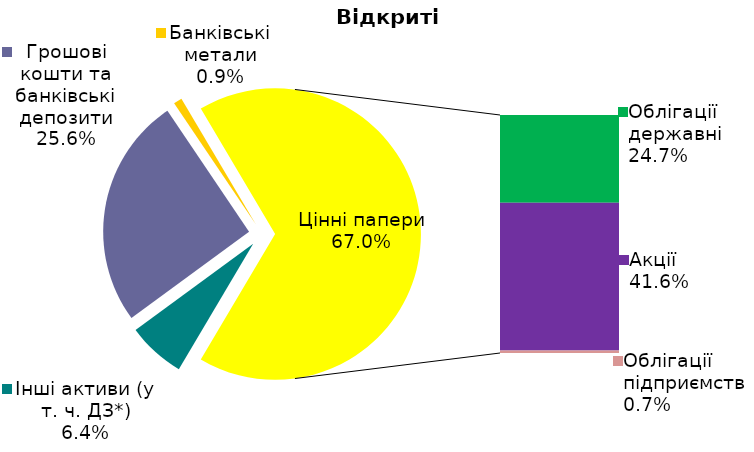
| Category | Series 0 |
|---|---|
| Інші активи (у т. ч. ДЗ*) | 0.064 |
| Грошові кошти та банківські депозити | 0.256 |
| Банківські метали | 0.009 |
| Облігації державні  | 0.247 |
| Акції | 0.416 |
| Облігації підприємств | 0.007 |